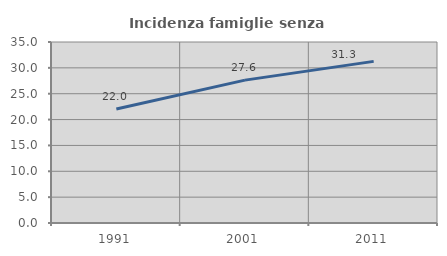
| Category | Incidenza famiglie senza nuclei |
|---|---|
| 1991.0 | 22.031 |
| 2001.0 | 27.631 |
| 2011.0 | 31.251 |